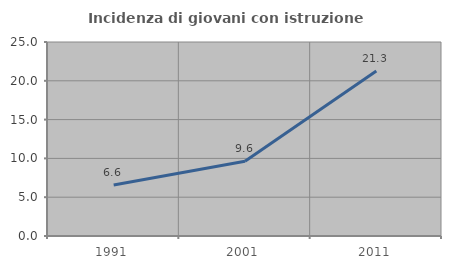
| Category | Incidenza di giovani con istruzione universitaria |
|---|---|
| 1991.0 | 6.579 |
| 2001.0 | 9.626 |
| 2011.0 | 21.269 |